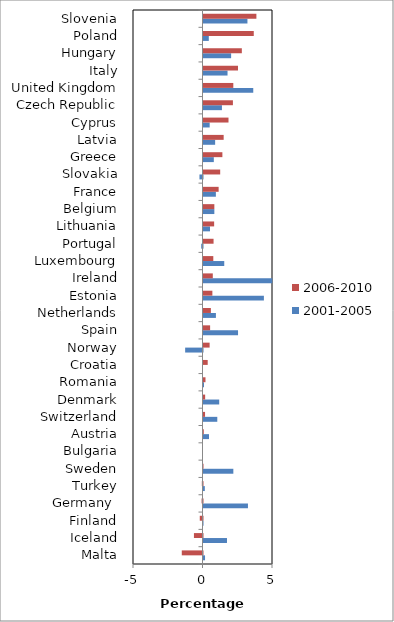
| Category | 2001-2005 | 2006-2010 |
|---|---|---|
| Malta | 0.111 | -1.491 |
| Iceland | 1.689 | -0.616 |
| Finland | -0.006 | -0.196 |
| Germany  | 3.198 | -0.066 |
| Turkey | 0.095 | -0.049 |
| Sweden | 2.147 | -0.006 |
| Bulgaria | 0 | 0 |
| Austria | 0.396 | 0.019 |
| Switzerland | 0.992 | 0.111 |
| Denmark | 1.13 | 0.119 |
| Romania | 0.036 | 0.143 |
| Croatia | 0 | 0.303 |
| Norway | -1.248 | 0.44 |
| Spain | 2.485 | 0.476 |
| Netherlands | 0.893 | 0.531 |
| Estonia | 4.345 | 0.638 |
| Ireland | 4.948 | 0.669 |
| Luxembourg | 1.493 | 0.705 |
| Portugal | -0.091 | 0.724 |
| Lithuania | 0.466 | 0.766 |
| Belgium | 0.78 | 0.78 |
| France | 0.89 | 1.089 |
| Slovakia | -0.218 | 1.201 |
| Greece | 0.742 | 1.358 |
| Latvia | 0.838 | 1.451 |
| Cyprus | 0.444 | 1.799 |
| Czech Republic | 1.326 | 2.116 |
| United Kingdom | 3.58 | 2.144 |
| Italy | 1.729 | 2.482 |
| Hungary | 1.987 | 2.758 |
| Poland | 0.381 | 3.617 |
| Slovenia | 3.161 | 3.806 |